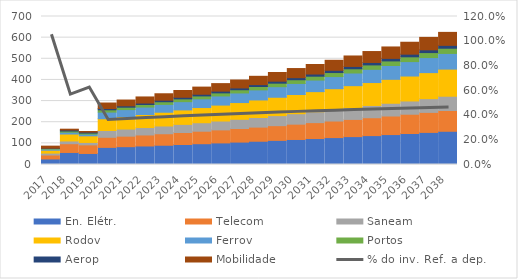
| Category | En. Elétr. | Telecom | Saneam | Rodov | Ferrov | Portos | Aerop | Mobilidade |
|---|---|---|---|---|---|---|---|---|
| 2017.0 | 26.201 | 18.606 | 9.113 | 13.543 | 5.316 | 3.417 | 0.886 | 9.746 |
| 2018.0 | 56.936 | 41.383 | 12.975 | 32.852 | 8.647 | 5.6 | 4.74 | 3.847 |
| 2019.0 | 52.173 | 40.694 | 11.402 | 31.354 | 7.802 | 5.227 | 4.584 | 2.978 |
| 2020.0 | 80.985 | 47.722 | 32.087 | 55.561 | 31.532 | 10.8 | 6.277 | 25.84 |
| 2021.0 | 84.251 | 49.869 | 33.591 | 58.612 | 33.318 | 11.38 | 6.584 | 27.33 |
| 2022.0 | 87.615 | 52.082 | 35.142 | 61.764 | 35.162 | 11.98 | 6.9 | 28.868 |
| 2023.0 | 91.079 | 54.364 | 36.743 | 65.017 | 37.067 | 12.599 | 7.226 | 30.458 |
| 2024.0 | 94.648 | 56.717 | 38.393 | 68.377 | 39.034 | 13.238 | 7.562 | 32.099 |
| 2025.0 | 98.322 | 59.142 | 40.094 | 71.844 | 41.065 | 13.898 | 7.909 | 33.794 |
| 2026.0 | 102.106 | 61.641 | 41.848 | 75.423 | 43.162 | 14.579 | 8.267 | 35.543 |
| 2027.0 | 106.002 | 64.217 | 43.656 | 79.116 | 45.325 | 15.281 | 8.636 | 37.349 |
| 2028.0 | 110.013 | 66.87 | 45.52 | 82.927 | 47.559 | 16.006 | 9.016 | 39.213 |
| 2029.0 | 114.142 | 69.605 | 47.441 | 86.859 | 49.863 | 16.754 | 9.409 | 41.137 |
| 2030.0 | 118.392 | 72.422 | 49.42 | 90.915 | 52.241 | 17.525 | 9.813 | 43.122 |
| 2031.0 | 122.766 | 75.323 | 51.46 | 95.098 | 54.694 | 18.32 | 10.23 | 45.17 |
| 2032.0 | 127.268 | 78.312 | 53.562 | 99.412 | 57.224 | 19.14 | 10.659 | 47.283 |
| 2033.0 | 131.901 | 81.391 | 55.727 | 103.861 | 59.833 | 19.986 | 11.102 | 49.462 |
| 2034.0 | 136.668 | 84.561 | 57.957 | 108.448 | 62.524 | 20.857 | 11.558 | 51.709 |
| 2035.0 | 141.574 | 87.825 | 60.254 | 113.177 | 65.298 | 21.756 | 12.027 | 54.027 |
| 2036.0 | 146.621 | 91.186 | 62.62 | 118.052 | 68.159 | 22.682 | 12.511 | 56.416 |
| 2037.0 | 151.813 | 94.647 | 65.056 | 123.076 | 71.108 | 23.636 | 13.01 | 58.88 |
| 2038.0 | 157.154 | 98.209 | 67.565 | 128.254 | 74.147 | 24.62 | 13.523 | 61.419 |